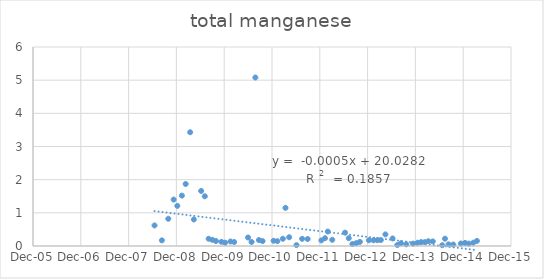
| Category | Series 0 |
|---|---|
| 39618.0 | 0.62 |
| 39674.0 | 0.17 |
| 39723.0 | 0.821 |
| 39764.0 | 1.4 |
| 39792.0 | 1.21 |
| 39827.0 | 1.52 |
| 39856.0 | 1.87 |
| 39890.0 | 3.43 |
| 39918.0 | 0.8 |
| 39974.0 | 1.66 |
| 40002.0 | 1.5 |
| 40031.0 | 0.219 |
| 40059.0 | 0.186 |
| 40087.0 | 0.15 |
| 40129.0 | 0.126 |
| 40157.0 | 0.101 |
| 40198.0 | 0.136 |
| 40226.0 | 0.12 |
| 40332.0 | 0.256 |
| 40359.0 | 0.122 |
| 40388.0 | 5.08 |
| 40415.0 | 0.179 |
| 40443.0 | 0.148 |
| 40527.0 | 0.158 |
| 40556.0 | 0.146 |
| 40598.0 | 0.217 |
| 40618.0 | 1.15 |
| 40646.0 | 0.264 |
| 40702.0 | 0.027 |
| 40745.0 | 0.216 |
| 40787.0 | 0.211 |
| 40892.0 | 0.169 |
| 40920.0 | 0.236 |
| 40941.0 | 0.436 |
| 40975.0 | 0.187 |
| 41073.0 | 0.403 |
| 41101.0 | 0.235 |
| 41129.0 | 0.06 |
| 41158.0 | 0.085 |
| 41186.0 | 0.124 |
| 41255.0 | 0.173 |
| 41290.0 | 0.173 |
| 41318.0 | 0.176 |
| 41346.0 | 0.179 |
| 41381.0 | 0.35 |
| 41436.0 | 0.228 |
| 41472.0 | 0.029 |
| 41500.0 | 0.084 |
| 41541.0 | 0.051 |
| 41592.0 | 0.072 |
| 41626.0 | 0.098 |
| 41653.0 | 0.117 |
| 41682.0 | 0.117 |
| 41709.0 | 0.144 |
| 41743.0 | 0.138 |
| 41815.0 | 0.023 |
| 41836.0 | 0.22 |
| 41863.0 | 0.049 |
| 41899.0 | 0.044 |
| 41957.0 | 0.076 |
| 41989.0 | 0.093 |
| 42017.0 | 0.072 |
| 42052.0 | 0.1 |
| 42080.0 | 0.154 |